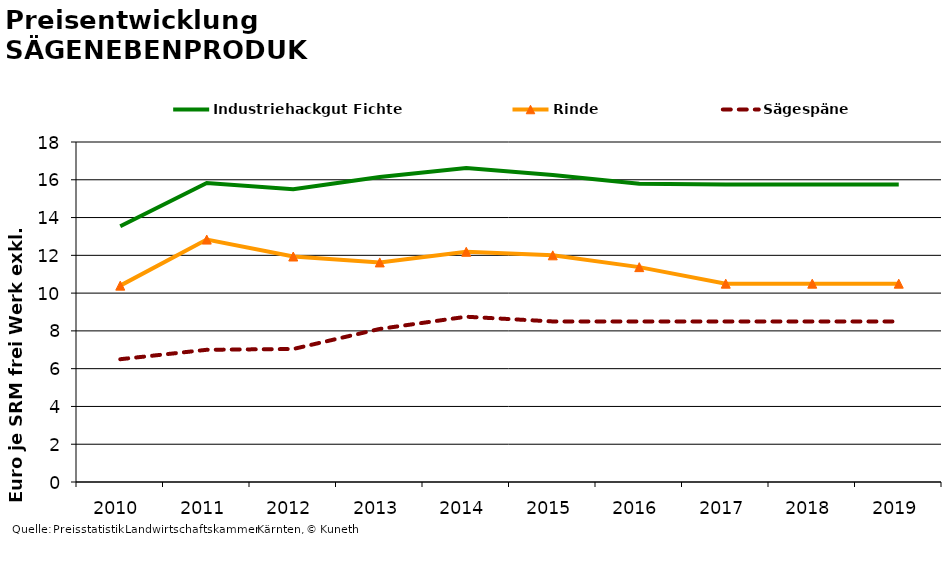
| Category | Industriehackgut Fichte | Rinde | Sägespäne |
|---|---|---|---|
| 2010.0 | 13.542 | 10.396 | 6.5 |
| 2011.0 | 15.833 | 12.833 | 7 |
| 2012.0 | 15.5 | 11.938 | 7.042 |
| 2013.0 | 16.146 | 11.625 | 8.104 |
| 2014.0 | 16.625 | 12.188 | 8.75 |
| 2015.0 | 16.25 | 12 | 8.5 |
| 2016.0 | 15.792 | 11.375 | 8.5 |
| 2017.0 | 15.75 | 10.5 | 8.5 |
| 2018.0 | 15.75 | 10.5 | 8.5 |
| 2019.0 | 15.75 | 10.5 | 8.5 |